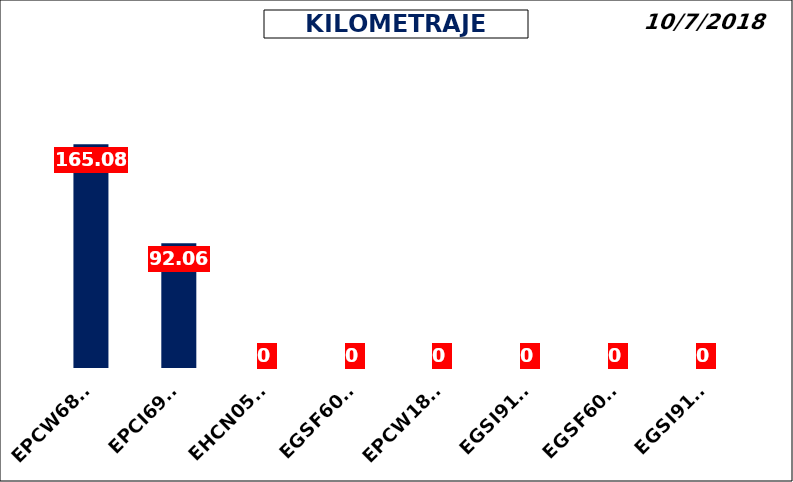
| Category | Total |
|---|---|
| EPCW6826 | 165.08 |
| EPCI6941 | 92.06 |
| EHCN0517 | 0 |
| EGSF6046 | 0 |
| EPCW1831 | 0 |
| EGSI9179 | 0 |
| EGSF6029 | 0 |
| EGSI9191 | 0 |